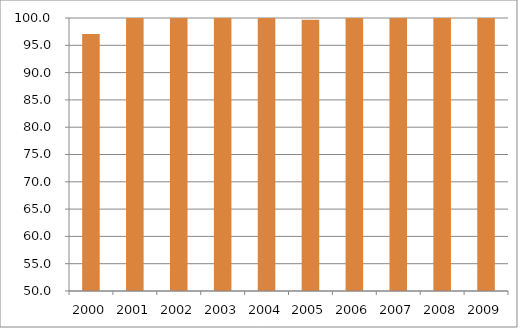
| Category | Região Centro-Oeste |
|---|---|
| 2000.0 | 97.08 |
| 2001.0 | 100.23 |
| 2002.0 | 102.14 |
| 2003.0 | 101.92 |
| 2004.0 | 104.17 |
| 2005.0 | 99.66 |
| 2006.0 | 100.7 |
| 2007.0 | 107.87 |
| 2008.0 | 100.97 |
| 2009.0 | 102.51 |